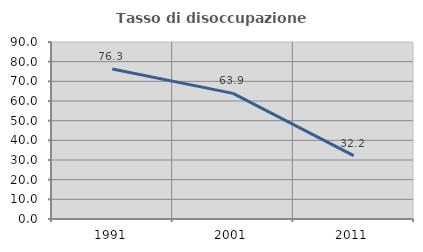
| Category | Tasso di disoccupazione giovanile  |
|---|---|
| 1991.0 | 76.316 |
| 2001.0 | 63.889 |
| 2011.0 | 32.203 |